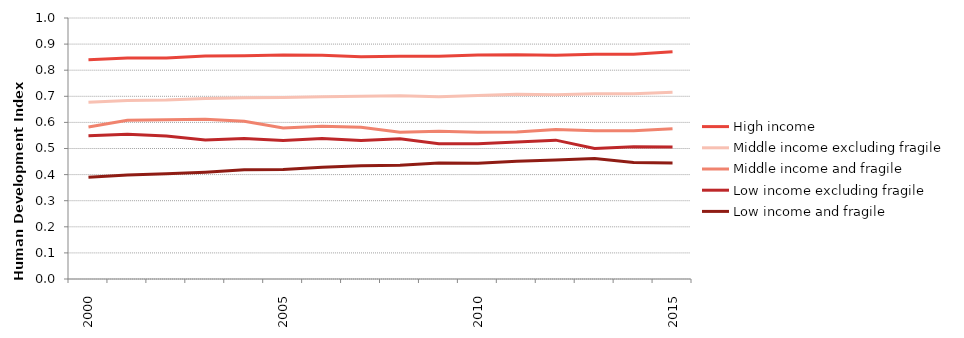
| Category | High income | Middle income excluding fragile | Middle income and fragile | Low income excluding fragile | Low income and fragile |
|---|---|---|---|---|---|
| 2000.0 | 0.84 | 0.677 | 0.583 | 0.549 | 0.39 |
| 2001.0 | 0.847 | 0.683 | 0.608 | 0.555 | 0.398 |
| 2002.0 | 0.847 | 0.686 | 0.61 | 0.548 | 0.403 |
| 2003.0 | 0.854 | 0.691 | 0.612 | 0.533 | 0.409 |
| 2004.0 | 0.855 | 0.694 | 0.604 | 0.538 | 0.419 |
| 2005.0 | 0.858 | 0.695 | 0.578 | 0.531 | 0.42 |
| 2006.0 | 0.857 | 0.698 | 0.585 | 0.538 | 0.428 |
| 2007.0 | 0.851 | 0.7 | 0.581 | 0.53 | 0.434 |
| 2008.0 | 0.853 | 0.702 | 0.562 | 0.537 | 0.436 |
| 2009.0 | 0.854 | 0.699 | 0.566 | 0.519 | 0.444 |
| 2010.0 | 0.859 | 0.703 | 0.562 | 0.518 | 0.443 |
| 2011.0 | 0.86 | 0.708 | 0.563 | 0.524 | 0.452 |
| 2012.0 | 0.857 | 0.706 | 0.573 | 0.532 | 0.455 |
| 2013.0 | 0.861 | 0.71 | 0.568 | 0.5 | 0.461 |
| 2014.0 | 0.861 | 0.71 | 0.568 | 0.507 | 0.447 |
| 2015.0 | 0.87 | 0.716 | 0.576 | 0.506 | 0.445 |